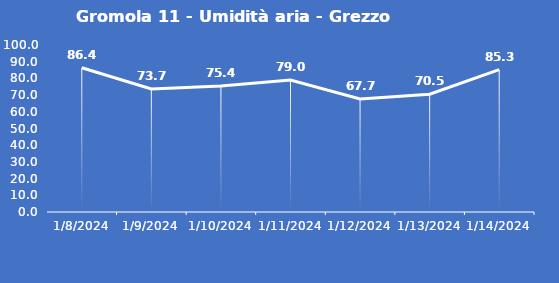
| Category | Gromola 11 - Umidità aria - Grezzo (%) |
|---|---|
| 1/8/24 | 86.4 |
| 1/9/24 | 73.7 |
| 1/10/24 | 75.4 |
| 1/11/24 | 79 |
| 1/12/24 | 67.7 |
| 1/13/24 | 70.5 |
| 1/14/24 | 85.3 |